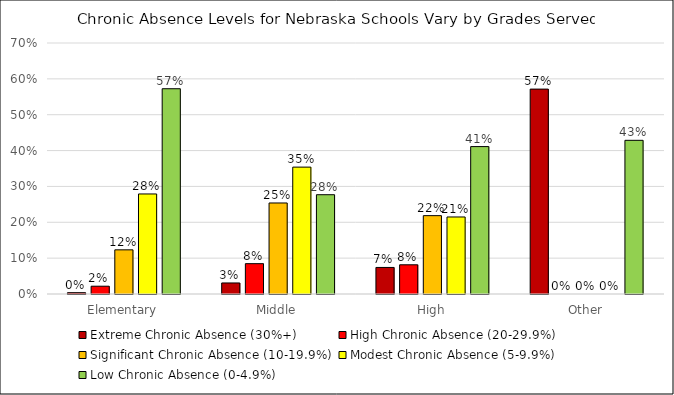
| Category | Extreme Chronic Absence (30%+) | High Chronic Absence (20-29.9%) | Significant Chronic Absence (10-19.9%) | Modest Chronic Absence (5-9.9%) | Low Chronic Absence (0-4.9%) |
|---|---|---|---|---|---|
| Elementary | 0.004 | 0.022 | 0.123 | 0.279 | 0.572 |
| Middle | 0.031 | 0.085 | 0.254 | 0.354 | 0.277 |
| High | 0.074 | 0.081 | 0.219 | 0.215 | 0.411 |
| Other | 0.571 | 0 | 0 | 0 | 0.429 |